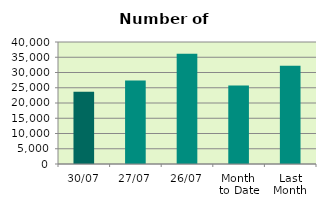
| Category | Series 0 |
|---|---|
| 30/07 | 23684 |
| 27/07 | 27348 |
| 26/07 | 36188 |
| Month 
to Date | 25773.048 |
| Last
Month | 32208.3 |